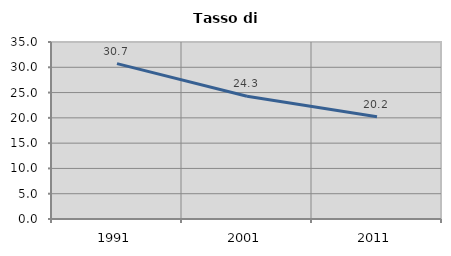
| Category | Tasso di disoccupazione   |
|---|---|
| 1991.0 | 30.722 |
| 2001.0 | 24.286 |
| 2011.0 | 20.238 |